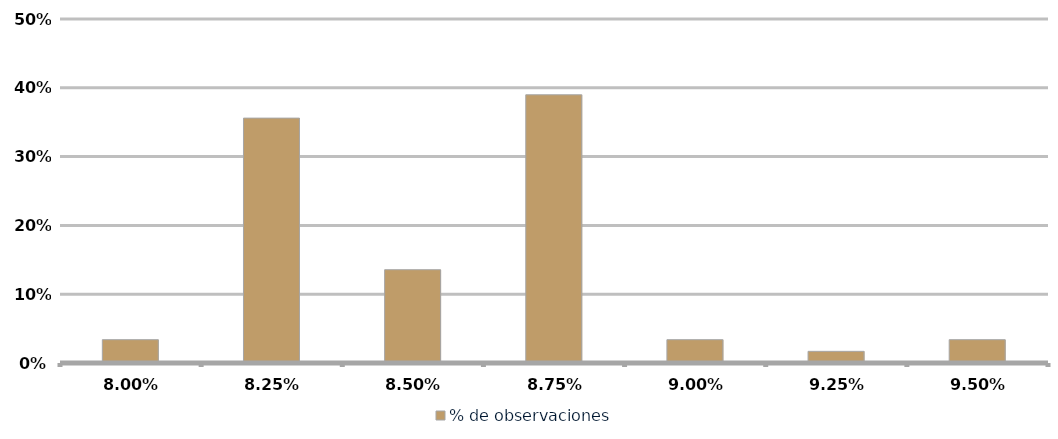
| Category | % de observaciones  |
|---|---|
| 0.08 | 0.034 |
| 0.0825 | 0.356 |
| 0.085 | 0.136 |
| 0.08750000000000001 | 0.39 |
| 0.09000000000000001 | 0.034 |
| 0.09250000000000001 | 0.017 |
| 0.09500000000000001 | 0.034 |